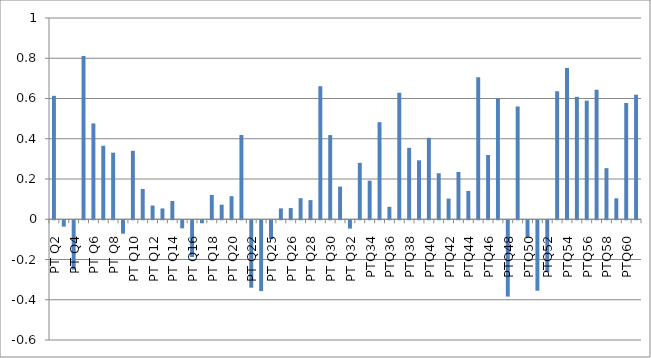
| Category | Series 0 |
|---|---|
| PT Q2 | 0.613 |
| PT Q3 | -0.031 |
| PT Q4 | -0.245 |
| PT Q5 | 0.811 |
| PT Q6 | 0.476 |
| PT Q7 | 0.365 |
| PT Q8 | 0.331 |
| PT Q9 | -0.067 |
| PT Q10 | 0.34 |
| PT Q11 | 0.15 |
| PT Q12 | 0.068 |
| PT Q13 | 0.054 |
| PT Q14 | 0.091 |
| PT Q15 | -0.04 |
| PT Q16 | -0.183 |
| PT Q17 | -0.015 |
| PT Q18 | 0.121 |
| PT Q19 | 0.072 |
| PT Q20 | 0.115 |
| PT Q21 | 0.419 |
| PT Q22 | -0.335 |
| PT Q23 | -0.352 |
| PT Q25 | -0.094 |
| PT Q25 | 0.054 |
| PT Q26 | 0.056 |
| PT Q27 | 0.105 |
| PT Q28 | 0.095 |
| PT Q29 | 0.661 |
| PT Q30 | 0.418 |
| PT Q31 | 0.162 |
| PT Q32 | -0.041 |
| PT Q33 | 0.28 |
| PTQ34 | 0.192 |
| PTQ35 | 0.482 |
| PTQ36 | 0.062 |
| PTQ37 | 0.629 |
| PTQ38 | 0.355 |
| PTQ39 | 0.293 |
| PTQ40 | 0.405 |
| PTQ41 | 0.229 |
| PTQ42 | 0.103 |
| PTQ43 | 0.235 |
| PTQ44 | 0.141 |
| PTQ45 | 0.706 |
| PTQ46 | 0.319 |
| PTQ47 | 0.6 |
| PTQ48 | -0.379 |
| PTQ49 | 0.56 |
| PTQ50 | -0.084 |
| PTQ51 | -0.35 |
| PTQ52 | -0.258 |
| PTQ53 | 0.635 |
| PTQ54 | 0.752 |
| PTQ55 | 0.608 |
| PTQ56 | 0.589 |
| PTQ57 | 0.644 |
| PTQ58 | 0.254 |
| PTQ59sc | 0.104 |
| PTQ60 | 0.578 |
| PTQ61 | 0.619 |